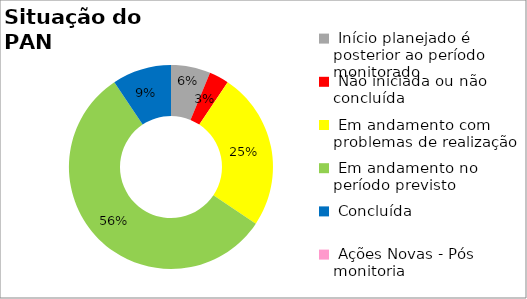
| Category | Series 0 |
|---|---|
|  Início planejado é posterior ao período monitorado | 0.062 |
|  Não iniciada ou não concluída | 0.031 |
|  Em andamento com problemas de realização | 0.25 |
|  Em andamento no período previsto  | 0.562 |
|  Concluída | 0.094 |
|  Ações Novas - Pós monitoria | 0 |